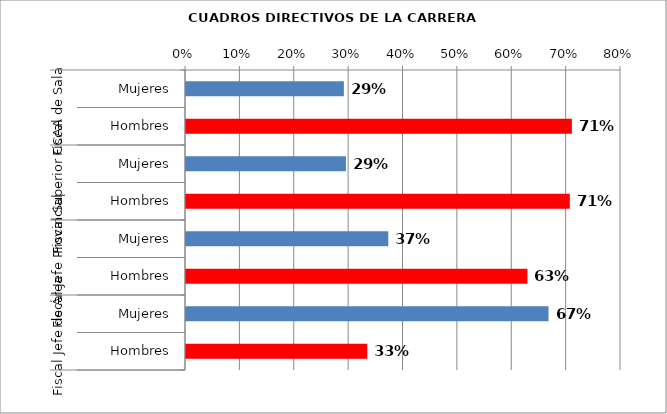
| Category | Series 0 |
|---|---|
| 0 | 0.29 |
| 1 | 0.71 |
| 2 | 0.294 |
| 3 | 0.706 |
| 4 | 0.372 |
| 5 | 0.628 |
| 6 | 0.667 |
| 7 | 0.333 |